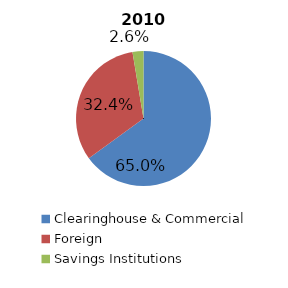
| Category | Series 0 |
|---|---|
| Clearinghouse & Commercial | 580407964 |
| Foreign | 289066496 |
| Savings Institutions | 23333705 |